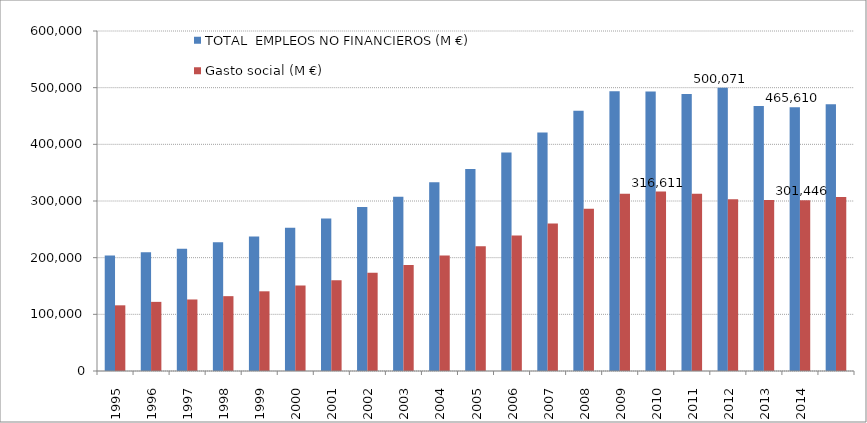
| Category | TOTAL  EMPLEOS NO FINANCIEROS (M €) | Gasto social (M €) |
|---|---|---|
| 1995.0 | 203628 | 115907 |
| 1996.0 | 209767 | 121999 |
| 1997.0 | 215539 | 126217 |
| 1998.0 | 227326 | 132068 |
| 1999.0 | 237335 | 140631 |
| 2000.0 | 252608 | 150861 |
| 2001.0 | 269026 | 160027 |
| 2002.0 | 289390 | 173373 |
| 2003.0 | 307526 | 186991 |
| 2004.0 | 333269 | 203927 |
| 2005.0 | 356470 | 220291 |
| 2006.0 | 385793 | 239249 |
| 2007.0 | 420680 | 260081 |
| 2008.0 | 459294 | 286169 |
| 2009.0 | 493865 | 312972 |
| 2010.0 | 493106 | 316611 |
| 2011.0 | 488618 | 312695 |
| 2012.0 | 500071 | 303250 |
| 2013.0 | 467450 | 301646 |
| 2014.0 | 465610 | 301446 |